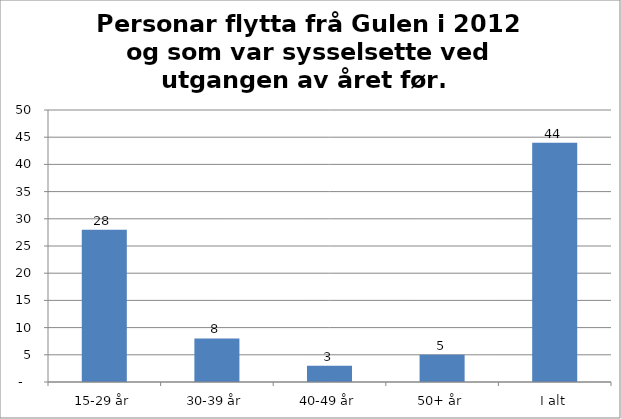
| Category | 1411 Gulen |
|---|---|
| 15-29 år | 28 |
| 30-39 år | 8 |
| 40-49 år | 3 |
| 50+ år | 5 |
| I alt | 44 |